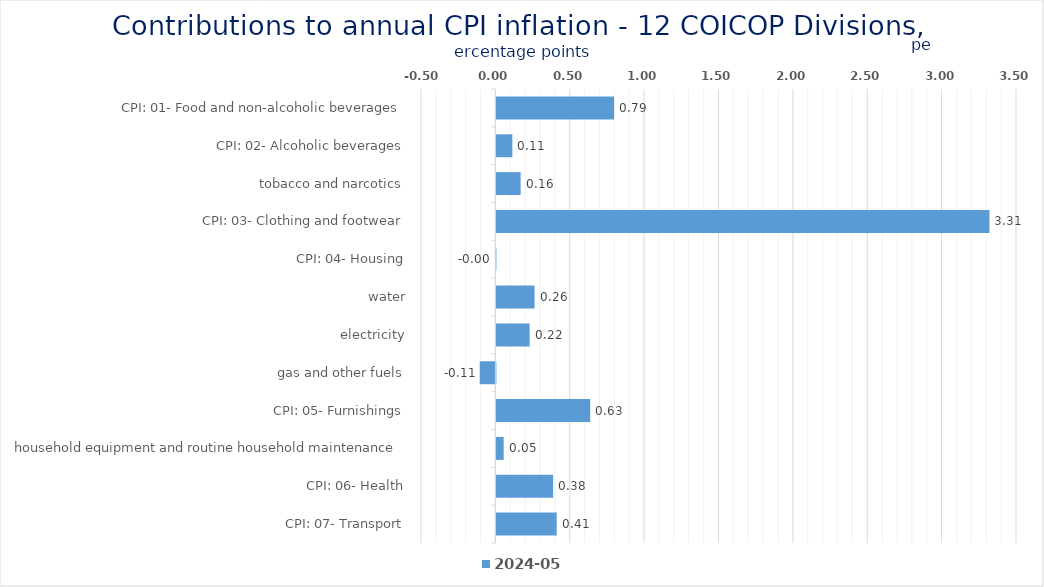
| Category | 2024-05 |
|---|---|
| CPI: 01- Food and non-alcoholic beverages | 0.791 |
| CPI: 02- Alcoholic beverages, tobacco and narcotics | 0.108 |
| CPI: 03- Clothing and footwear | 0.163 |
| CPI: 04- Housing, water, electricity, gas and other fuels | 3.315 |
| CPI: 05- Furnishings, household equipment and routine household maintenance | -0.002 |
| CPI: 06- Health | 0.257 |
| CPI: 07- Transport | 0.224 |
| CPI: 08- Communication | -0.105 |
| CPI: 09- Recreation and culture | 0.631 |
| CPI: 10- Education | 0.049 |
| CPI: 11- Restaurants and hotels | 0.381 |
| CPI: 12- Miscellaneous goods and services | 0.406 |